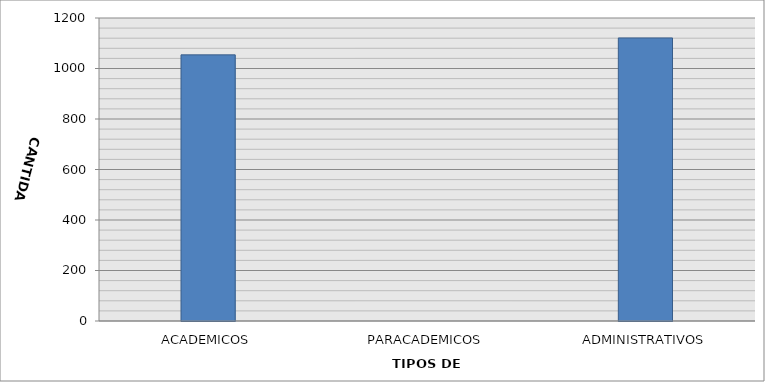
| Category | CANTIDAD |
|---|---|
| ACADEMICOS | 1054 |
| PARACADEMICOS | 0 |
| ADMINISTRATIVOS | 1121 |